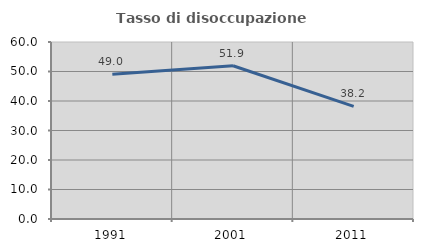
| Category | Tasso di disoccupazione giovanile  |
|---|---|
| 1991.0 | 49.042 |
| 2001.0 | 51.948 |
| 2011.0 | 38.202 |